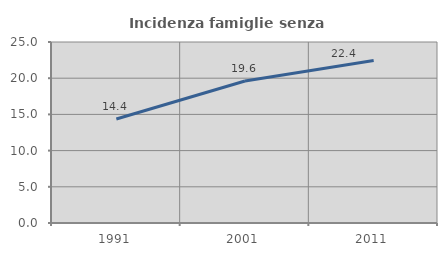
| Category | Incidenza famiglie senza nuclei |
|---|---|
| 1991.0 | 14.373 |
| 2001.0 | 19.606 |
| 2011.0 | 22.435 |